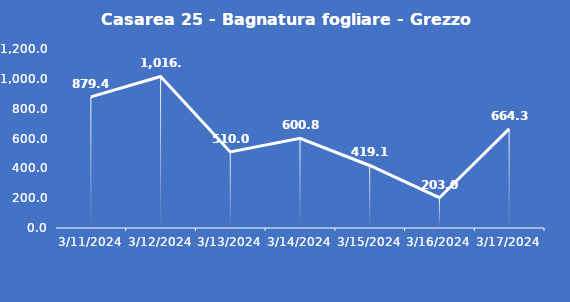
| Category | Casarea 25 - Bagnatura fogliare - Grezzo (min) |
|---|---|
| 3/11/24 | 879.4 |
| 3/12/24 | 1016 |
| 3/13/24 | 510 |
| 3/14/24 | 600.8 |
| 3/15/24 | 419.1 |
| 3/16/24 | 203 |
| 3/17/24 | 664.3 |